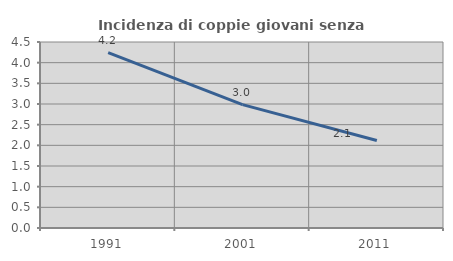
| Category | Incidenza di coppie giovani senza figli |
|---|---|
| 1991.0 | 4.241 |
| 2001.0 | 2.985 |
| 2011.0 | 2.119 |